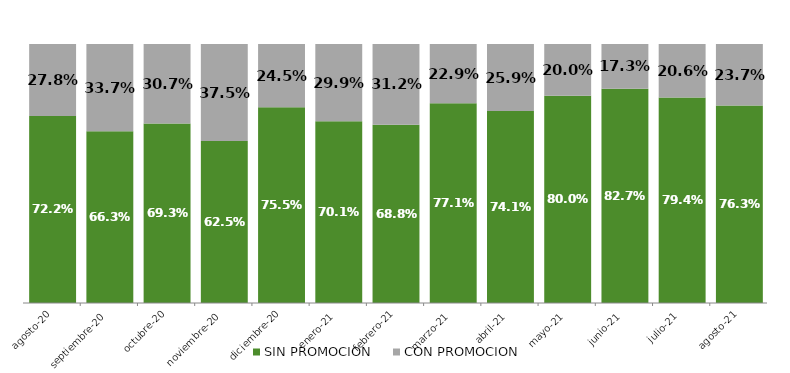
| Category | SIN PROMOCION   | CON PROMOCION   |
|---|---|---|
| 2020-08-01 | 0.722 | 0.278 |
| 2020-09-01 | 0.663 | 0.337 |
| 2020-10-01 | 0.693 | 0.307 |
| 2020-11-01 | 0.625 | 0.375 |
| 2020-12-01 | 0.755 | 0.245 |
| 2021-01-01 | 0.701 | 0.299 |
| 2021-02-01 | 0.688 | 0.312 |
| 2021-03-01 | 0.771 | 0.229 |
| 2021-04-01 | 0.741 | 0.259 |
| 2021-05-01 | 0.8 | 0.2 |
| 2021-06-01 | 0.827 | 0.173 |
| 2021-07-01 | 0.794 | 0.206 |
| 2021-08-01 | 0.763 | 0.237 |